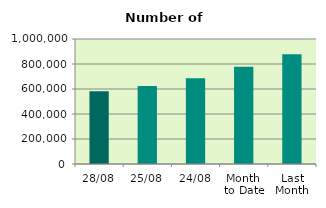
| Category | Series 0 |
|---|---|
| 28/08 | 581756 |
| 25/08 | 624868 |
| 24/08 | 686132 |
| Month 
to Date | 778566.6 |
| Last
Month | 877151.619 |